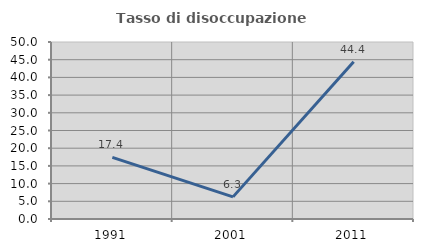
| Category | Tasso di disoccupazione giovanile  |
|---|---|
| 1991.0 | 17.391 |
| 2001.0 | 6.25 |
| 2011.0 | 44.444 |